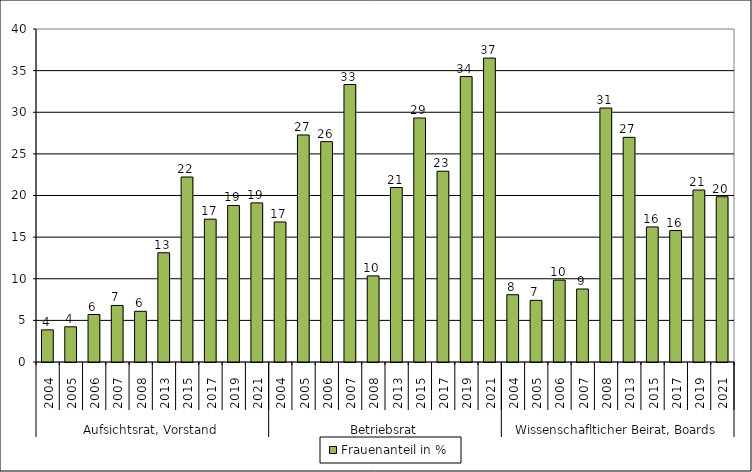
| Category | Frauenanteil in % |
|---|---|
| 0 | 3.86 |
| 1 | 4.23 |
| 2 | 5.705 |
| 3 | 6.792 |
| 4 | 6.091 |
| 5 | 13.122 |
| 6 | 22.222 |
| 7 | 17.157 |
| 8 | 18.8 |
| 9 | 19.113 |
| 10 | 16.822 |
| 11 | 27.273 |
| 12 | 26.471 |
| 13 | 33.333 |
| 14 | 10.345 |
| 15 | 20.961 |
| 16 | 29.31 |
| 17 | 22.917 |
| 18 | 34.286 |
| 19 | 36.508 |
| 20 | 8.081 |
| 21 | 7.407 |
| 22 | 9.839 |
| 23 | 8.769 |
| 24 | 30.508 |
| 25 | 26.984 |
| 26 | 16.225 |
| 27 | 15.789 |
| 28 | 20.656 |
| 29 | 19.845 |